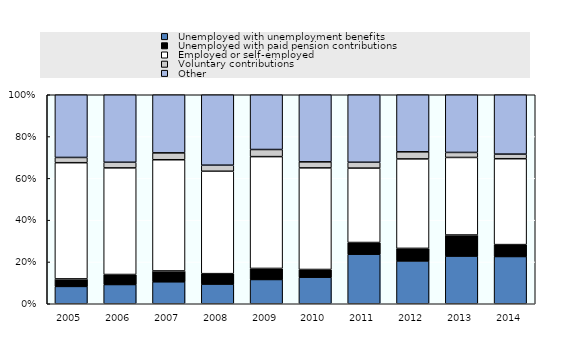
| Category |   Unemployed with unemployment benefits |   Unemployed with paid pension contributions |   Employed or self-employed |   Voluntary contributions |   Other |
|---|---|---|---|---|---|
| 2005.0 | 0.083 | 0.036 | 0.556 | 0.025 | 0.3 |
| 2006.0 | 0.092 | 0.048 | 0.51 | 0.027 | 0.323 |
| 2007.0 | 0.105 | 0.052 | 0.532 | 0.033 | 0.278 |
| 2008.0 | 0.094 | 0.05 | 0.49 | 0.029 | 0.337 |
| 2009.0 | 0.116 | 0.053 | 0.535 | 0.034 | 0.262 |
| 2010.0 | 0.127 | 0.037 | 0.486 | 0.029 | 0.321 |
| 2011.0 | 0.237 | 0.056 | 0.356 | 0.028 | 0.323 |
| 2012.0 | 0.205 | 0.06 | 0.428 | 0.034 | 0.273 |
| 2013.0 | 0.228 | 0.101 | 0.371 | 0.024 | 0.276 |
| 2014.0 | 0.226 | 0.057 | 0.411 | 0.022 | 0.284 |